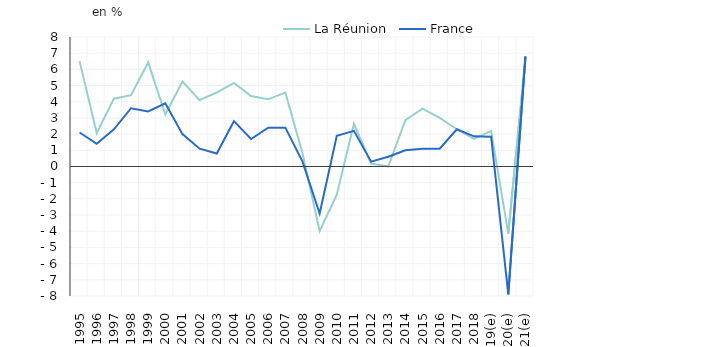
| Category | La Réunion | France |
|---|---|---|
| 1995 | 6.51 | 2.1 |
| 1996 | 2.07 | 1.4 |
| 1997 | 4.19 | 2.3 |
| 1998 | 4.41 | 3.6 |
| 1999 | 6.43 | 3.4 |
| 2000 | 3.21 | 3.9 |
| 2001 | 5.25 | 2 |
| 2002 | 4.1 | 1.1 |
| 2003 | 4.57 | 0.8 |
| 2004 | 5.16 | 2.8 |
| 2005 | 4.35 | 1.7 |
| 2006 | 4.15 | 2.4 |
| 2007 | 4.56 | 2.4 |
| 2008 | 0.82 | 0.3 |
| 2009 | -3.99 | -2.9 |
| 2010 | -1.74 | 1.9 |
| 2011 | 2.64 | 2.2 |
| 2012 | 0.18 | 0.3 |
| 2013 | 0 | 0.6 |
| 2014 | 2.86 | 1 |
| 2015 | 3.58 | 1.1 |
| 2016 | 3 | 1.1 |
| 2017 | 2.3 | 2.3 |
| 2018 | 1.7 | 1.865 |
| 2019(e) | 2.2 | 1.843 |
| 2020(e) | -4.15 | -7.9 |
| 2021(e) | 6.7 | 6.8 |